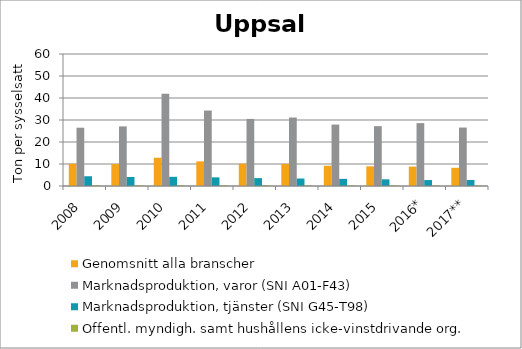
| Category | Genomsnitt alla branscher | Marknadsproduktion, varor (SNI A01-F43) | Marknadsproduktion, tjänster (SNI G45-T98) | Offentl. myndigh. samt hushållens icke-vinstdrivande org. |
|---|---|---|---|---|
| 2008 | 10.133 | 26.501 | 4.436 | 0.33 |
| 2009 | 9.948 | 27.099 | 4.102 | 0.323 |
| 2010 | 12.851 | 41.964 | 4.172 | 0.324 |
| 2011 | 11.191 | 34.304 | 3.935 | 0.305 |
| 2012 | 10.142 | 30.491 | 3.586 | 0.308 |
| 2013 | 10.044 | 31.12 | 3.404 | 0.27 |
| 2014 | 9.209 | 27.92 | 3.241 | 0.25 |
| 2015 | 8.94 | 27.208 | 3.037 | 0.279 |
| 2016* | 8.818 | 28.582 | 2.706 | 0.265 |
| 2017** | 8.274 | 26.575 | 2.742 | 0.247 |